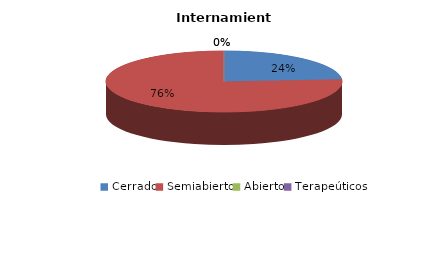
| Category | Series 0 |
|---|---|
| Cerrado | 5 |
| Semiabierto | 16 |
| Abierto | 0 |
| Terapeúticos | 0 |